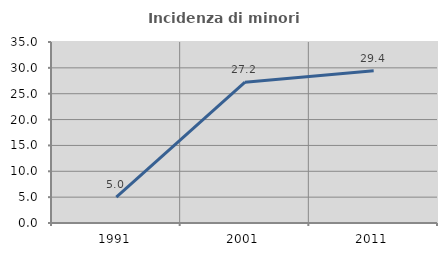
| Category | Incidenza di minori stranieri |
|---|---|
| 1991.0 | 5 |
| 2001.0 | 27.237 |
| 2011.0 | 29.424 |